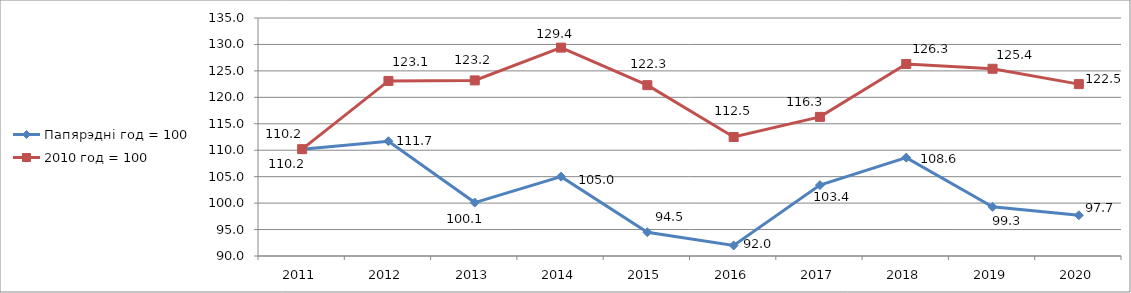
| Category | Папярэдні год = 100 | 2010 год = 100 |
|---|---|---|
| 2011.0 | 110.2 |  |
| 2012.0 | 111.7 |  |
| 2013.0 | 100.1 |  |
| 2014.0 | 105 |  |
| 2015.0 | 94.5 |  |
| 2016.0 | 92 |  |
| 2017.0 | 103.4 |  |
| 2018.0 | 108.6 |  |
| 2019.0 | 99.3 |  |
| 2020.0 | 97.7 |  |